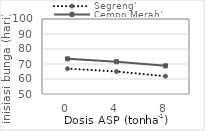
| Category | Segreng' | Cempo Merah' |
|---|---|---|
| 0.0 | 66.89 | 73.44 |
| 4.0 | 65 | 71.55 |
| 8.0 | 61.89 | 68.77 |